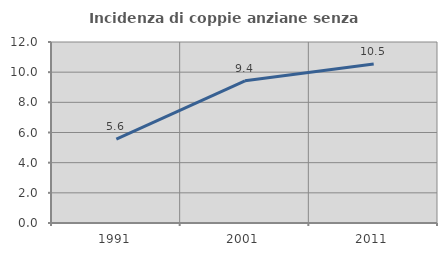
| Category | Incidenza di coppie anziane senza figli  |
|---|---|
| 1991.0 | 5.556 |
| 2001.0 | 9.426 |
| 2011.0 | 10.541 |